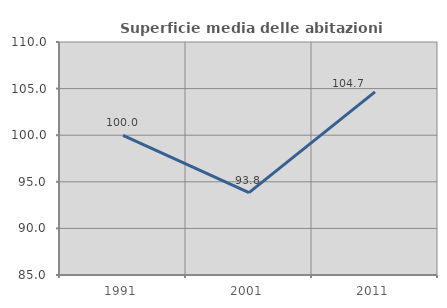
| Category | Superficie media delle abitazioni occupate |
|---|---|
| 1991.0 | 99.977 |
| 2001.0 | 93.846 |
| 2011.0 | 104.653 |